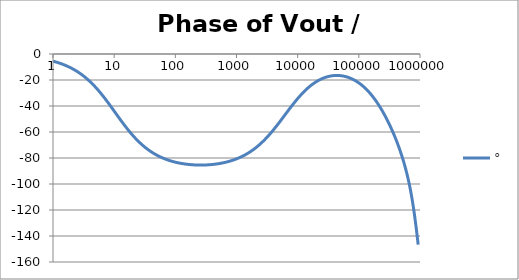
| Category | ° |
|---|---|
| 1.0 | -5.506 |
| 1.0715193052376064 | -5.898 |
| 1.1481536214968828 | -6.316 |
| 1.2302687708123814 | -6.764 |
| 1.318256738556407 | -7.242 |
| 1.4125375446227544 | -7.754 |
| 1.513561248436208 | -8.301 |
| 1.6218100973589298 | -8.886 |
| 1.7378008287493754 | -9.51 |
| 1.8620871366628673 | -10.176 |
| 1.9952623149688797 | -10.887 |
| 2.1379620895022318 | -11.645 |
| 2.2908676527677727 | -12.453 |
| 2.45470891568503 | -13.313 |
| 2.6302679918953817 | -14.227 |
| 2.8183829312644537 | -15.199 |
| 3.0199517204020156 | -16.23 |
| 3.235936569296282 | -17.323 |
| 3.467368504525316 | -18.48 |
| 3.7153522909717256 | -19.703 |
| 3.9810717055349727 | -20.992 |
| 4.265795188015926 | -22.349 |
| 4.570881896148749 | -23.774 |
| 4.897788193684462 | -25.267 |
| 5.2480746024977245 | -26.827 |
| 5.62341325190349 | -28.452 |
| 6.025595860743575 | -30.139 |
| 6.456542290346554 | -31.884 |
| 6.918309709189363 | -33.683 |
| 7.4131024130091765 | -35.529 |
| 7.943282347242814 | -37.418 |
| 8.511380382023765 | -39.34 |
| 9.120108393559095 | -41.287 |
| 9.772372209558105 | -43.252 |
| 10.47128548050899 | -45.224 |
| 11.22018454301963 | -47.193 |
| 12.022644346174127 | -49.152 |
| 12.88249551693134 | -51.09 |
| 13.803842646028851 | -52.999 |
| 14.791083881682074 | -54.871 |
| 15.848931924611136 | -56.698 |
| 16.98243652461744 | -58.474 |
| 18.197008586099834 | -60.194 |
| 19.498445997580447 | -61.853 |
| 20.892961308540382 | -63.449 |
| 22.387211385683386 | -64.977 |
| 23.988329190194897 | -66.437 |
| 25.703957827688622 | -67.828 |
| 27.54228703338165 | -69.15 |
| 29.51209226666385 | -70.403 |
| 31.62277660168379 | -71.588 |
| 33.884415613920254 | -72.706 |
| 36.307805477010106 | -73.76 |
| 38.90451449942804 | -74.751 |
| 41.686938347033525 | -75.681 |
| 44.6683592150963 | -76.553 |
| 47.86300923226381 | -77.369 |
| 51.28613839913647 | -78.132 |
| 54.95408738576247 | -78.843 |
| 58.88436553555889 | -79.506 |
| 63.09573444801931 | -80.123 |
| 67.60829753919813 | -80.695 |
| 72.44359600749901 | -81.226 |
| 77.62471166286915 | -81.717 |
| 83.17637711026705 | -82.17 |
| 89.12509381337456 | -82.587 |
| 95.49925860214357 | -82.969 |
| 102.32929922807544 | -83.319 |
| 109.64781961431841 | -83.638 |
| 117.48975549395293 | -83.927 |
| 125.89254117941665 | -84.188 |
| 134.89628825916537 | -84.421 |
| 144.54397707459273 | -84.628 |
| 154.88166189124806 | -84.81 |
| 165.95869074375608 | -84.967 |
| 177.82794100389225 | -85.1 |
| 190.5460717963248 | -85.211 |
| 204.17379446695278 | -85.298 |
| 218.77616239495524 | -85.363 |
| 234.42288153199212 | -85.406 |
| 251.18864315095806 | -85.427 |
| 269.15348039269156 | -85.426 |
| 288.4031503126605 | -85.404 |
| 309.0295432513591 | -85.36 |
| 331.1311214825911 | -85.294 |
| 354.81338923357566 | -85.205 |
| 380.18939632056095 | -85.094 |
| 407.3802778041123 | -84.959 |
| 436.5158322401654 | -84.801 |
| 467.7351412871979 | -84.618 |
| 501.18723362727184 | -84.41 |
| 537.0317963702526 | -84.175 |
| 575.4399373371566 | -83.913 |
| 616.5950018614822 | -83.622 |
| 660.6934480075952 | -83.302 |
| 707.9457843841375 | -82.95 |
| 758.5775750291831 | -82.566 |
| 812.8305161640983 | -82.148 |
| 870.9635899560801 | -81.693 |
| 933.2543007969903 | -81.201 |
| 999.9999999999998 | -80.669 |
| 1071.5193052376057 | -80.095 |
| 1148.1536214968828 | -79.477 |
| 1230.2687708123801 | -78.813 |
| 1318.2567385564053 | -78.1 |
| 1412.537544622753 | -77.337 |
| 1513.5612484362066 | -76.52 |
| 1621.8100973589292 | -75.648 |
| 1737.8008287493742 | -74.719 |
| 1862.0871366628671 | -73.729 |
| 1995.2623149688786 | -72.678 |
| 2137.9620895022326 | -71.563 |
| 2290.867652767771 | -70.383 |
| 2454.708915685027 | -69.136 |
| 2630.26799189538 | -67.823 |
| 2818.382931264451 | -66.443 |
| 3019.9517204020176 | -64.996 |
| 3235.9365692962774 | -63.484 |
| 3467.368504525316 | -61.909 |
| 3715.352290971724 | -60.274 |
| 3981.07170553497 | -58.584 |
| 4265.795188015923 | -56.842 |
| 4570.881896148745 | -55.056 |
| 4897.788193684463 | -53.232 |
| 5248.074602497726 | -51.378 |
| 5623.413251903489 | -49.502 |
| 6025.595860743574 | -47.615 |
| 6456.54229034655 | -45.725 |
| 6918.309709189357 | -43.842 |
| 7413.102413009165 | -41.976 |
| 7943.282347242815 | -40.137 |
| 8511.380382023763 | -38.334 |
| 9120.108393559092 | -36.575 |
| 9772.3722095581 | -34.868 |
| 10471.285480509003 | -33.22 |
| 11220.184543019639 | -31.637 |
| 12022.64434617411 | -30.124 |
| 12882.495516931338 | -28.685 |
| 13803.842646028841 | -27.324 |
| 14791.083881682063 | -26.042 |
| 15848.931924611119 | -24.841 |
| 16982.436524617453 | -23.722 |
| 18197.008586099837 | -22.687 |
| 19498.445997580417 | -21.734 |
| 20892.961308540387 | -20.863 |
| 22387.211385683382 | -20.075 |
| 23988.32919019488 | -19.367 |
| 25703.957827688606 | -18.74 |
| 27542.28703338167 | -18.192 |
| 29512.092266663854 | -17.722 |
| 31622.77660168378 | -17.33 |
| 33884.41561392023 | -17.015 |
| 36307.805477010166 | -16.776 |
| 38904.514499428085 | -16.612 |
| 41686.93834703348 | -16.524 |
| 44668.35921509631 | -16.512 |
| 47863.00923226382 | -16.576 |
| 51286.13839913646 | -16.715 |
| 54954.08738576241 | -16.932 |
| 58884.365535558936 | -17.226 |
| 63095.73444801934 | -17.6 |
| 67608.29753919817 | -18.054 |
| 72443.59600749899 | -18.59 |
| 77624.71166286913 | -19.21 |
| 83176.37711026703 | -19.916 |
| 89125.09381337445 | -20.711 |
| 95499.25860214363 | -21.596 |
| 102329.29922807543 | -22.576 |
| 109647.81961431848 | -23.652 |
| 117489.75549395289 | -24.828 |
| 125892.54117941685 | -26.106 |
| 134896.28825916522 | -27.489 |
| 144543.97707459255 | -28.981 |
| 154881.66189124787 | -30.584 |
| 165958.69074375575 | -32.3 |
| 177827.9410038922 | -34.133 |
| 190546.07179632425 | -36.085 |
| 204173.79446695274 | -38.157 |
| 218776.16239495497 | -40.352 |
| 234422.88153199226 | -42.671 |
| 251188.64315095753 | -45.117 |
| 269153.480392691 | -47.691 |
| 288403.15031266044 | -50.397 |
| 309029.5432513582 | -53.239 |
| 331131.1214825907 | -56.222 |
| 354813.3892335749 | -59.354 |
| 380189.3963205612 | -62.648 |
| 407380.2778041119 | -66.12 |
| 436515.8322401649 | -69.795 |
| 467735.14128719777 | -73.706 |
| 501187.2336272717 | -77.898 |
| 537031.7963702519 | -82.434 |
| 575439.9373371559 | -87.399 |
| 616595.001861482 | -92.905 |
| 660693.4480075944 | -99.099 |
| 707945.7843841374 | -106.164 |
| 758577.575029183 | -114.312 |
| 812830.5161640996 | -123.747 |
| 870963.5899560791 | -134.571 |
| 933254.3007969892 | -146.644 |